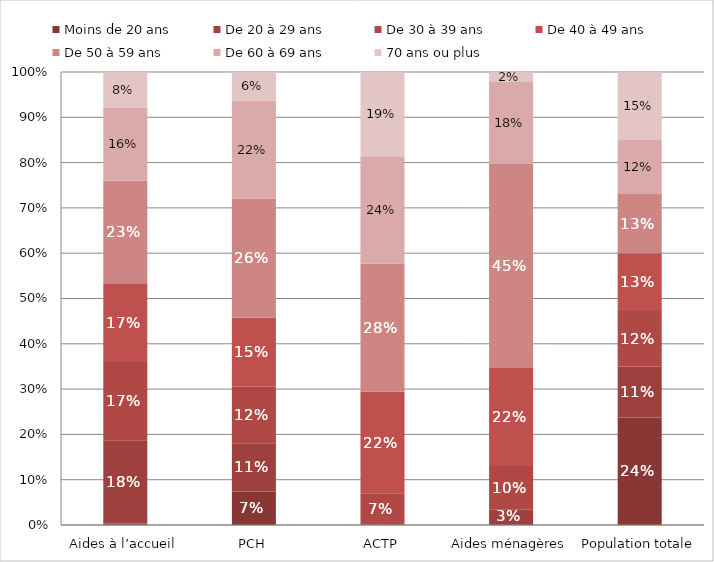
| Category | Moins de 20 ans  | De 20 à 29 ans | De 30 à 39 ans | De 40 à 49 ans |  De 50 à 59 ans |  De 60 à 69 ans | 70 ans ou plus |
|---|---|---|---|---|---|---|---|
| 0 | 0.003 | 0.184 | 0.173 | 0.174 | 0.227 | 0.161 | 0.078 |
| 1 | 0.074 | 0.106 | 0.125 | 0.153 | 0.262 | 0.217 | 0.063 |
| 2 | 0 | 0 | 0.07 | 0.224 | 0.283 | 0.237 | 0.186 |
| 3 | 0 | 0.033 | 0.096 | 0.218 | 0.449 | 0.181 | 0.022 |
| 4 | 0.237 | 0.112 | 0.122 | 0.127 | 0.131 | 0.119 | 0.15 |